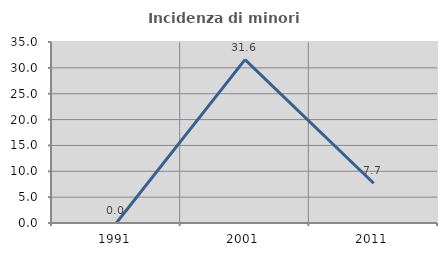
| Category | Incidenza di minori stranieri |
|---|---|
| 1991.0 | 0 |
| 2001.0 | 31.579 |
| 2011.0 | 7.692 |